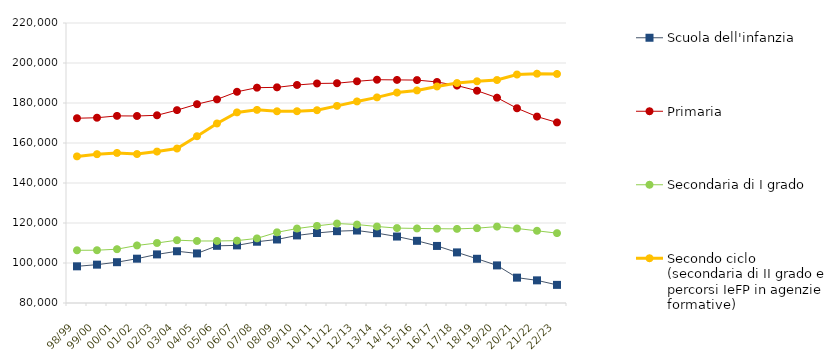
| Category | Scuola dell'infanzia | Primaria | Secondaria di I grado | Secondo ciclo (secondaria di II grado e percorsi IeFP in agenzie formative) |
|---|---|---|---|---|
| 98/99 | 98338 | 172388 | 106354 | 153306 |
| 99/00 | 99175 | 172629 | 106386 | 154413 |
| 00/01 | 100404 | 173560 | 106901 | 155040 |
| 01/02 | 102158 | 173506 | 108777 | 154484 |
| 02/03 | 104301 | 173854 | 110000 | 155707 |
| 03/04 | 105881 | 176434 | 111415 | 157225 |
| 04/05 | 104790 | 179413 | 111006 | 163382 |
| 05/06 | 108600 | 181806 | 111008 | 169759 |
| 06/07 | 108806 | 185610 | 111173 | 175306 |
| 07/08 | 110639 | 187671 | 112306 | 176567 |
| 08/09 | 111758 | 187828 | 115345 | 175861 |
| 09/10 | 113796 | 189007 | 117229 | 175883 |
| 10/11 | 115009 | 189769 | 118568 | 176391 |
| 11/12 | 115919 | 189898 | 119731 | 178565 |
| 12/13 | 116243 | 190849 | 119227 | 180793 |
| 13/14 | 114915 | 191642 | 118248 | 182803 |
| 14/15 | 113226 | 191547 | 117453 | 185205 |
| 15/16 | 111087 | 191459 | 117277 | 186283 |
| 16/17 | 108529 | 190511 | 117150 | 188270 |
| 17/18 | 105302 | 188722 | 117056 | 189976 |
| 18/19 | 102111 | 186144 | 117412 | 190853 |
| 19/20 | 98799 | 182651 | 118210 | 191494 |
| 20/21 | 92675 | 177368 | 117252 | 194245 |
| 21/22 | 91327 | 173208 | 116101 | 194649 |
| 22/23 | 89061 | 170277 | 114924 | 194530 |